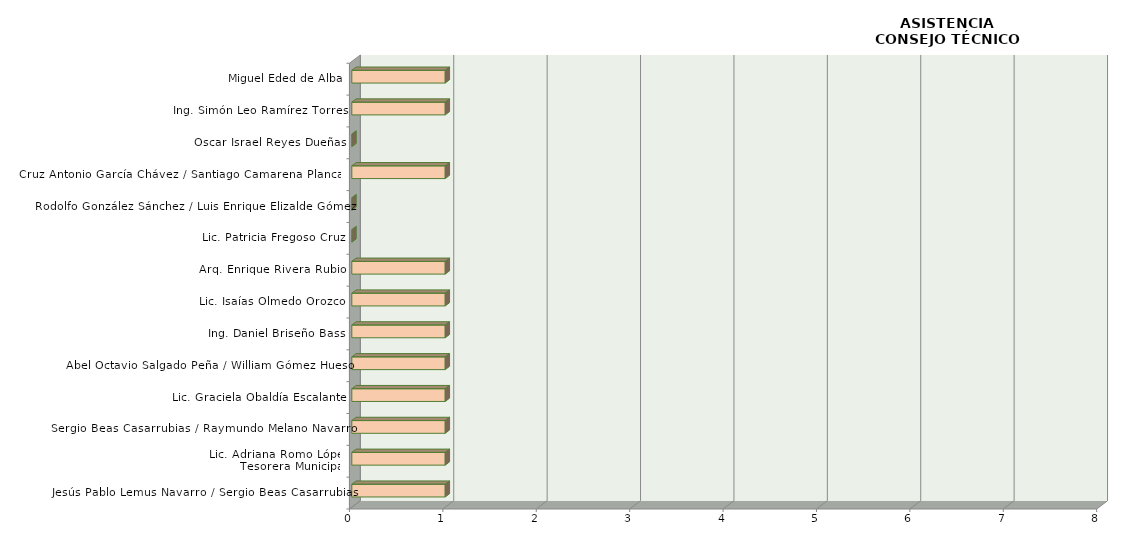
| Category | Series 0 |
|---|---|
| Jesús Pablo Lemus Navarro / Sergio Beas Casarrubias | 1 |
| Lic. Adriana Romo López
Tesorera Municipal | 1 |
| Sergio Beas Casarrubias / Raymundo Melano Navarro | 1 |
| Lic. Graciela Obaldía Escalante | 1 |
| Abel Octavio Salgado Peña / William Gómez Hueso | 1 |
| Ing. Daniel Briseño Bass | 1 |
| Lic. Isaías Olmedo Orozco | 1 |
| Arq. Enrique Rivera Rubio | 1 |
| Lic. Patricia Fregoso Cruz | 0 |
| Rodolfo González Sánchez / Luis Enrique Elizalde Gómez | 0 |
|  Cruz Antonio García Chávez / Santiago Camarena Plancarte | 1 |
| Oscar Israel Reyes Dueñas | 0 |
| Ing. Simón Leo Ramírez Torres | 1 |
| Miguel Eded de Alba | 1 |